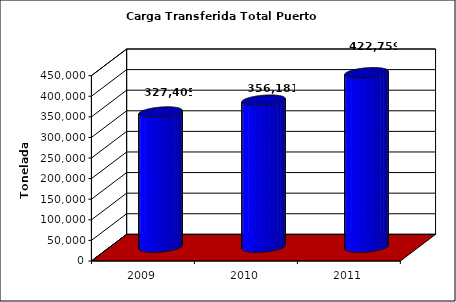
| Category | Series 0 |
|---|---|
| 2009.0 | 327405 |
| 2010.0 | 356180.6 |
| 2011.0 | 422759 |